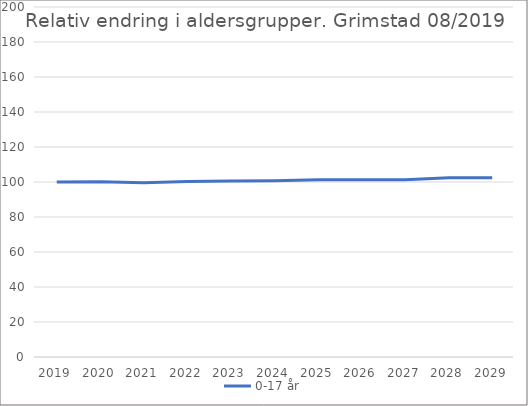
| Category | 0-17 år |
|---|---|
| 2019 | 100 |
| 2020 | 100.2 |
| 2021 | 99.551 |
| 2022 | 100.347 |
| 2023 | 100.564 |
| 2024 | 100.67 |
| 2025 | 101.278 |
| 2026 | 101.226 |
| 2027 | 101.351 |
| 2028 | 102.486 |
| 2029 | 102.492 |